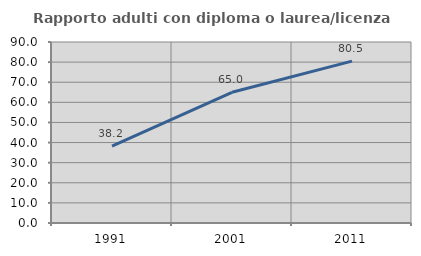
| Category | Rapporto adulti con diploma o laurea/licenza media  |
|---|---|
| 1991.0 | 38.182 |
| 2001.0 | 65 |
| 2011.0 | 80.488 |